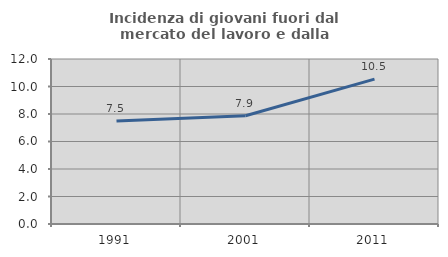
| Category | Incidenza di giovani fuori dal mercato del lavoro e dalla formazione  |
|---|---|
| 1991.0 | 7.485 |
| 2001.0 | 7.877 |
| 2011.0 | 10.538 |